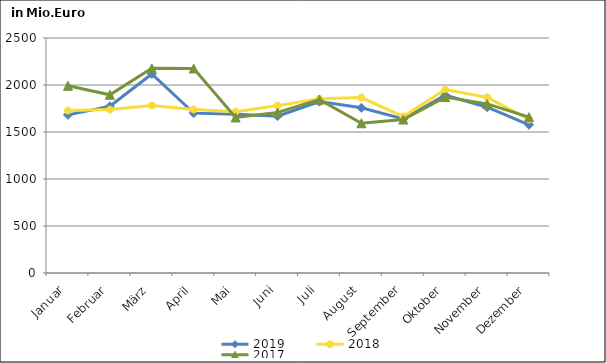
| Category | 2019 | 2018 | 2017 |
|---|---|---|---|
| Januar | 1682.146 | 1727.684 | 1991.964 |
| Februar | 1773.522 | 1738.473 | 1895.588 |
| März | 2117.026 | 1781.436 | 2177.247 |
| April | 1700.707 | 1739.573 | 2175.425 |
| Mai | 1687.92 | 1715.38 | 1654.637 |
| Juni | 1668.221 | 1780.701 | 1707.941 |
| Juli | 1823.387 | 1853.648 | 1844.042 |
| August | 1757.216 | 1865.997 | 1592.718 |
| September | 1638.701 | 1664.581 | 1632.185 |
| Oktober | 1892.145 | 1952.346 | 1870.85 |
| November | 1763.648 | 1868.402 | 1798.673 |
| Dezember | 1576.545 | 1633.549 | 1658.261 |